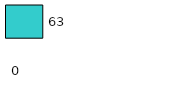
| Category | Series 0 | Series 1 |
|---|---|---|
| 0 | 0 | 63 |